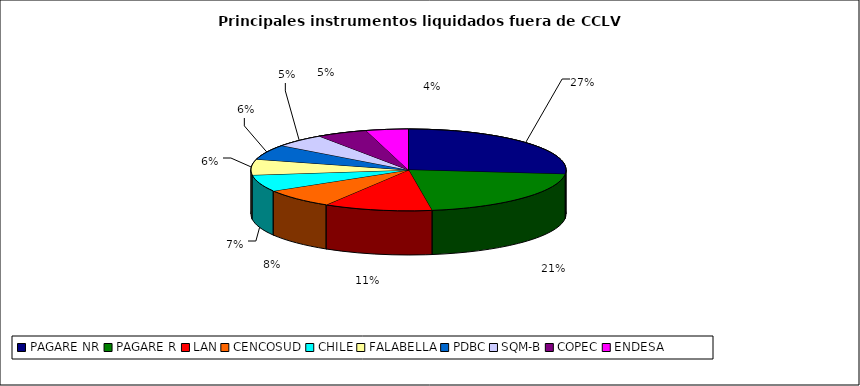
| Category | Series 0 |
|---|---|
| PAGARE NR | 1572 |
| PAGARE R | 1232 |
| LAN | 655 |
| CENCOSUD | 452 |
| CHILE | 388 |
| FALABELLA | 366 |
| PDBC | 349 |
| SQM-B | 311 |
| COPEC | 307 |
| ENDESA | 256 |